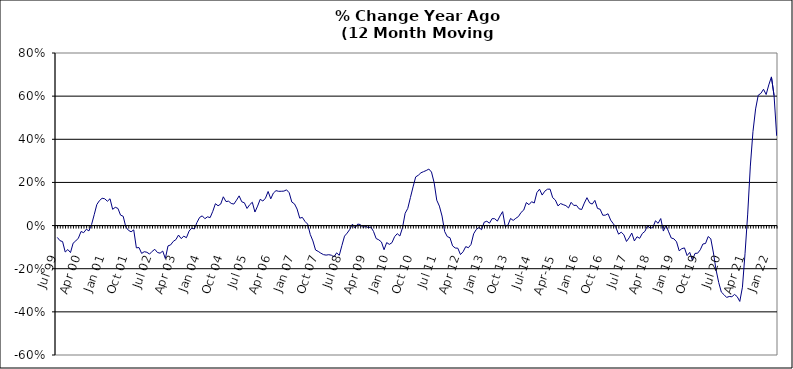
| Category | Series 0 |
|---|---|
| Jul 99 | -0.055 |
| Aug 99 | -0.07 |
| Sep 99 | -0.074 |
| Oct 99 | -0.123 |
| Nov 99 | -0.111 |
| Dec 99 | -0.125 |
| Jan 00 | -0.082 |
| Feb 00 | -0.071 |
| Mar 00 | -0.058 |
| Apr 00 | -0.027 |
| May 00 | -0.033 |
| Jun 00 | -0.017 |
| Jul 00 | -0.025 |
| Aug 00 | 0.005 |
| Sep 00 | 0.05 |
| Oct 00 | 0.098 |
| Nov 00 | 0.116 |
| Dec 00 | 0.127 |
| Jan 01 | 0.124 |
| Feb 01 | 0.113 |
| Mar 01 | 0.124 |
| Apr 01 | 0.075 |
| May 01 | 0.085 |
| Jun 01 | 0.08 |
| Jul 01 | 0.048 |
| Aug 01 | 0.043 |
| Sep 01 | -0.007 |
| Oct 01 | -0.022 |
| Nov 01 | -0.029 |
| Dec 01 | -0.02 |
| Jan 02 | -0.103 |
| Feb 02 | -0.102 |
| Mar 02 | -0.129 |
| Apr 02 | -0.121 |
| May 02 | -0.124 |
| Jun 02 | -0.132 |
| Jul 02 | -0.119 |
| Aug 02 | -0.11 |
| Sep 02 | -0.125 |
| Oct 02 | -0.128 |
| Nov 02 | -0.118 |
| Dec 02 | -0.153 |
| Jan 03 | -0.094 |
| Feb 03 | -0.09 |
| Mar 03 | -0.073 |
| Apr 03 | -0.065 |
| May 03 | -0.044 |
| Jun 03 | -0.06 |
| Jul 03 | -0.049 |
| Aug 03 | -0.056 |
| Sep 03 | -0.026 |
| Oct 03 | -0.012 |
| Nov 03 | -0.016 |
| Dec 03 | 0.014 |
| Jan 04 | 0.038 |
| Feb 04 | 0.045 |
| Mar 04 | 0.032 |
| Apr 04 | 0.041 |
| May 04 | 0.037 |
| Jun 04 | 0.066 |
| Jul 04 | 0.101 |
| Aug 04 | 0.092 |
| Sep 04 | 0.1 |
| Oct 04 | 0.133 |
| Nov 04 | 0.111 |
| Dec 04 | 0.113 |
| Jan 05 | 0.103 |
| Feb 05 | 0.1 |
| Mar 05 | 0.118 |
| Apr 05 | 0.138 |
| May 05 | 0.11 |
| Jun 05 | 0.106 |
| Jul 05 | 0.079 |
| Aug 05 | 0.097 |
| Sep 05 | 0.108 |
| Oct 05 | 0.063 |
| Nov 05 | 0.09 |
| Dec 05 | 0.122 |
| Jan 06 | 0.114 |
| Feb 06 | 0.127 |
| Mar 06 | 0.158 |
| Apr 06 | 0.124 |
| May 06 | 0.151 |
| Jun 06 | 0.162 |
| Jul 06 | 0.159 |
| Aug 06 | 0.159 |
| Sep 06 | 0.16 |
| Oct 06 | 0.166 |
| Nov 06 | 0.152 |
| Dec 06 | 0.109 |
| Jan 07 | 0.101 |
| Feb 07 | 0.076 |
| Mar 07 | 0.034 |
| Apr 07 | 0.038 |
| May 07 | 0.019 |
| Jun 07 | 0.007 |
| Jul 07 | -0.041 |
| Aug 07 | -0.071 |
| Sep 07 | -0.113 |
| Oct 07 | -0.12 |
| Nov 07 | -0.128 |
| Dec 07 | -0.135 |
| Jan 08 | -0.137 |
| Feb 08 | -0.135 |
| Mar 08 | -0.137 |
| Apr 08 | -0.145 |
| May 08 | -0.126 |
| Jun 08 | -0.138 |
| Jul 08 | -0.093 |
| Aug 08 | -0.049 |
| Sep-08 | -0.035 |
| Oct 08 | -0.018 |
| Nov 08 | 0.007 |
| Dec 08 | -0.011 |
| Jan 09 | 0.007 |
| Feb 09 | 0.005 |
| Mar 09 | -0.009 |
| Apr 09 | -0.003 |
| May 09 | -0.01 |
| Jun 09 | -0.007 |
| Jul 09 | -0.027 |
| Aug 09 | -0.06 |
| Sep 09 | -0.066 |
| Oct 09 | -0.076 |
| Nov 09 | -0.112 |
| Dec 09 | -0.079 |
| Jan 10 | -0.087 |
| Feb 10 | -0.079 |
| Mar 10 | -0.052 |
| Apr 10 | -0.037 |
| May 10 | -0.048 |
| Jun 10 | -0.01 |
| Jul 10 | 0.057 |
| Aug 10 | 0.08 |
| Sep 10 | 0.13 |
| Oct 10 | 0.179 |
| Nov 10 | 0.226 |
| Dec 10 | 0.233 |
| Jan 11 | 0.245 |
| Feb 11 | 0.25 |
| Mar 11 | 0.255 |
| Apr 11 | 0.262 |
| May 11 | 0.248 |
| Jun 11 | 0.199 |
| Jul 11 | 0.118 |
| Aug 11 | 0.09 |
| Sep 11 | 0.044 |
| Oct 11 | -0.028 |
| Nov 11 | -0.051 |
| Dec 11 | -0.056 |
| Jan 12 | -0.094 |
| Feb 12 | -0.104 |
| Mar 12 | -0.105 |
| Apr 12 | -0.134 |
| May 12 | -0.121 |
| Jun 12 | -0.098 |
| Jul 12 | -0.103 |
| Aug 12 | -0.087 |
| Sep 12 | -0.038 |
| Oct 12 | -0.018 |
| Nov 12 | -0.009 |
| Dec 12 | -0.019 |
| Jan 13 | 0.016 |
| Feb-13 | 0.02 |
| Mar-13 | 0.011 |
| Apr 13 | 0.032 |
| May 13 | 0.032 |
| Jun-13 | 0.021 |
| Jul 13 | 0.045 |
| Aug 13 | 0.065 |
| Sep 13 | -0.005 |
| Oct 13 | 0.002 |
| Nov 13 | 0.033 |
| Dec 13 | 0.024 |
| Jan 14 | 0.034 |
| Feb-14 | 0.042 |
| Mar 14 | 0.061 |
| Apr 14 | 0.072 |
| May 14 | 0.107 |
| Jun 14 | 0.097 |
| Jul-14 | 0.111 |
| Aug-14 | 0.105 |
| Sep 14 | 0.153 |
| Oct 14 | 0.169 |
| Nov 14 | 0.141 |
| Dec 14 | 0.159 |
| Jan 15 | 0.169 |
| Feb 15 | 0.169 |
| Mar 15 | 0.129 |
| Apr-15 | 0.118 |
| May 15 | 0.091 |
| Jun-15 | 0.102 |
| Jul 15 | 0.097 |
| Aug 15 | 0.092 |
| Sep 15 | 0.082 |
| Oct 15 | 0.108 |
| Nov 15 | 0.093 |
| Dec 15 | 0.094 |
| Jan 16 | 0.078 |
| Feb 16 | 0.075 |
| Mar 16 | 0.104 |
| Apr 16 | 0.129 |
| May 16 | 0.105 |
| Jun 16 | 0.1 |
| Jul 16 | 0.117 |
| Aug 16 | 0.08 |
| Sep 16 | 0.076 |
| Oct 16 | 0.048 |
| Nov 16 | 0.048 |
| Dec 16 | 0.055 |
| Jan 17 | 0.025 |
| Feb 17 | 0.009 |
| Mar 17 | -0.01 |
| Apr 17 | -0.04 |
| May 17 | -0.031 |
| Jun 17 | -0.042 |
| Jul 17 | -0.074 |
| Aug 17 | -0.057 |
| Sep 17 | -0.035 |
| Oct 17 | -0.071 |
| Nov 17 | -0.052 |
| Dec 17 | -0.059 |
| Jan 18 | -0.037 |
| Feb 18 | -0.027 |
| Mar 18 | 0 |
| Apr 18 | -0.012 |
| May 18 | -0.009 |
| Jun 18 | 0.022 |
| Jul 18 | 0.01 |
| Aug 18 | 0.033 |
| Sep 18 | -0.025 |
| Oct 18 | 0.002 |
| Nov 18 | -0.029 |
| Dec 18 | -0.058 |
| Jan 19 | -0.061 |
| Feb 19 | -0.075 |
| Mar 19 | -0.117 |
| Apr 19 | -0.107 |
| May 19 | -0.104 |
| Jun 19 | -0.139 |
| Jul 19 | -0.124 |
| Aug 19 | -0.16 |
| Sep 19 | -0.129 |
| Oct 19 | -0.128 |
| Nov 19 | -0.112 |
| Dec 19 | -0.085 |
| Jan 20 | -0.083 |
| Feb 20 | -0.051 |
| Mar 20 | -0.061 |
| Apr 20 | -0.127 |
| May 20 | -0.206 |
| Jun 20 | -0.264 |
| Jul 20 | -0.308 |
| Aug 20 | -0.32 |
| Sep 20 | -0.333 |
| Oct 20 | -0.329 |
| Nov 20 | -0.33 |
| Dec 20 | -0.319 |
| Jan 21 | -0.329 |
| Feb 21 | -0.352 |
| Mar 21 | -0.286 |
| Apr 21 | -0.129 |
| May 21 | 0.053 |
| Jun 21 | 0.276 |
| Jul 21 | 0.435 |
| Aug 21 | 0.541 |
| Sep 21 | 0.604 |
| Oct 21 | 0.613 |
| Nov 21 | 0.632 |
| Dec 21 | 0.608 |
| Jan 22 | 0.652 |
| Feb 22 | 0.689 |
| Mar 22 | 0.603 |
| Apr 22 | 0.416 |